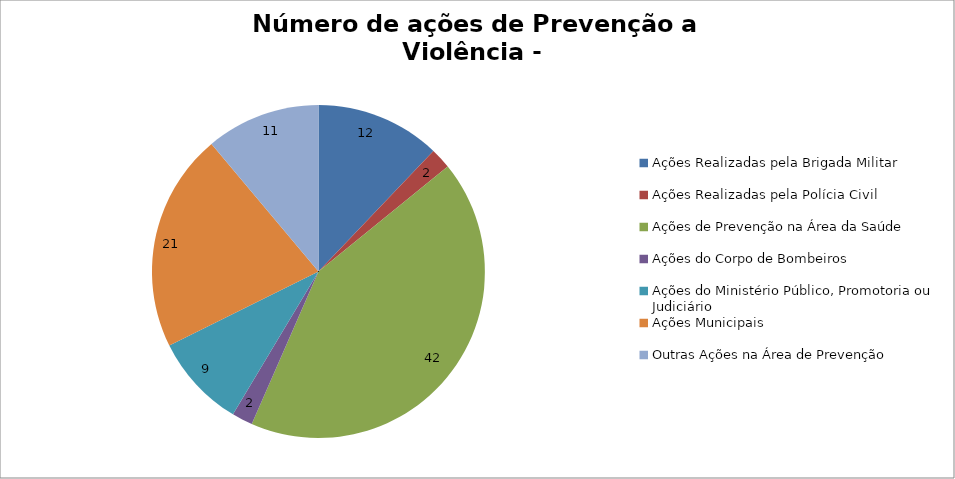
| Category | Número de Ações |
|---|---|
| Ações Realizadas pela Brigada Militar | 12 |
| Ações Realizadas pela Polícia Civil | 2 |
| Ações de Prevenção na Área da Saúde | 42 |
| Ações do Corpo de Bombeiros | 2 |
| Ações do Ministério Público, Promotoria ou Judiciário | 9 |
| Ações Municipais | 21 |
| Outras Ações na Área de Prevenção | 11 |